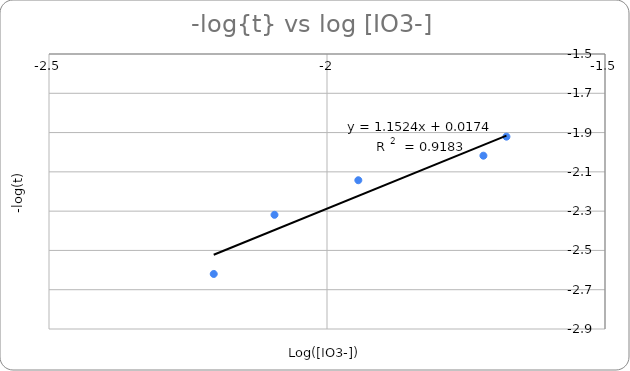
| Category | log([IO3-]) |
|---|---|
| -1.677241845946654 | -1.921 |
| -1.7186677353162108 | -2.018 |
| -1.943642882752129 | -2.143 |
| -2.0944361880179563 | -2.319 |
| -2.203739808633858 | -2.62 |